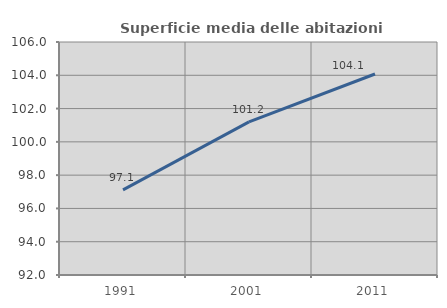
| Category | Superficie media delle abitazioni occupate |
|---|---|
| 1991.0 | 97.117 |
| 2001.0 | 101.202 |
| 2011.0 | 104.079 |